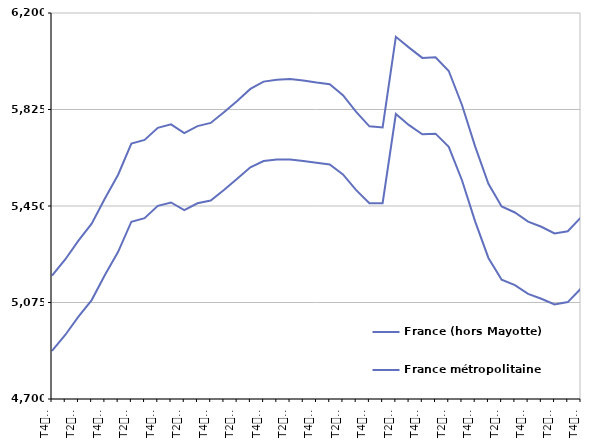
| Category | France (hors Mayotte) | France métropolitaine |
|---|---|---|
| T4
2013 | 5179.6 | 4886.7 |
| T1
2014 | 5242.1 | 4948.8 |
| T2
2014 | 5315.4 | 5020.2 |
| T3
2014 | 5381.3 | 5084.4 |
| T4
2014 | 5479.3 | 5181.5 |
| T1
2015 | 5571.4 | 5271.8 |
| T2
2015 | 5692.5 | 5388.9 |
| T3
2015 | 5706.9 | 5402.8 |
| T4
2015 | 5753.9 | 5450.5 |
| T1
2016 | 5767.1 | 5463.7 |
| T2
2016 | 5733.1 | 5434 |
| T3
2016 | 5760.5 | 5460.6 |
| T4
2016 | 5772.8 | 5471.4 |
| T1
2017 | 5814.6 | 5512.3 |
| T2
2017 | 5858 | 5555.6 |
| T3
2017 | 5905 | 5600.3 |
| T4
2017 | 5933.3 | 5624.8 |
| T1
2018 | 5941 | 5630.6 |
| T2
2018 | 5943.1 | 5630.6 |
| T3
2018 | 5937.4 | 5625 |
| T4
2018 | 5929.6 | 5617.8 |
| T1
2019 | 5923.2 | 5611.3 |
| T2
2019 | 5880.4 | 5572.5 |
| T3
2019 | 5815.6 | 5511.7 |
| T4
2019 | 5759.5 | 5461 |
| T1
2020 | 5755.4 | 5460.8 |
| T2
2020 | 6107.6 | 5807.5 |
| T3
2020 | 6065.4 | 5764.1 |
| T4
2020 | 6025.6 | 5728.8 |
| T1
2021 | 6027.6 | 5731.1 |
| T2
2021 | 5974.6 | 5679.8 |
| T3
2021 | 5842.6 | 5550.2 |
| T4
2021 | 5680.8 | 5389.5 |
| T1
2022 | 5536 | 5248.1 |
| T2
2022 | 5448 | 5163.7 |
| T3
2022 | 5424.8 | 5142.3 |
| T4
2022 | 5389.5 | 5108.6 |
| T1
2023 | 5369.3 | 5089.6 |
| T2
2023 | 5343.2 | 5067.7 |
| T3
2023 | 5352 | 5076.6 |
| T4
2023 | 5406 | 5129.6 |